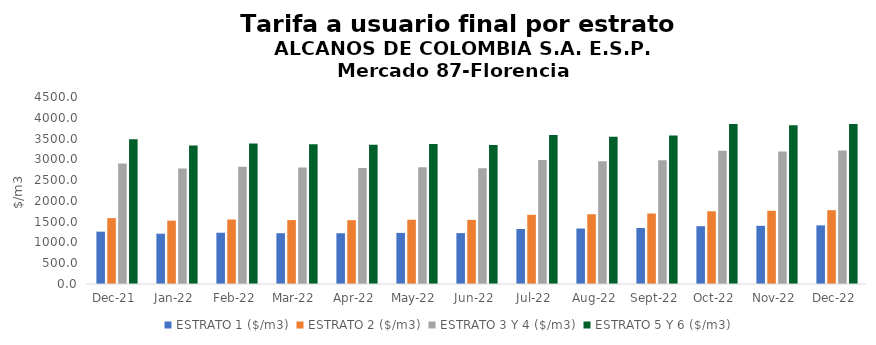
| Category | ESTRATO 1 ($/m3) | ESTRATO 2 ($/m3) | ESTRATO 3 Y 4 ($/m3) | ESTRATO 5 Y 6 ($/m3) |
|---|---|---|---|---|
| 2021-12-01 | 1260.02 | 1585.16 | 2902.39 | 3482.868 |
| 2022-01-01 | 1211.22 | 1524.02 | 2778.76 | 3334.512 |
| 2022-02-01 | 1233.39 | 1552.41 | 2818.77 | 3382.524 |
| 2022-03-01 | 1222.16 | 1538.54 | 2801.57 | 3361.884 |
| 2022-04-01 | 1220.79 | 1535.57 | 2791.83 | 3350.196 |
| 2022-05-01 | 1229.71 | 1546.92 | 2808.77 | 3370.524 |
| 2022-06-01 | 1224.76 | 1543.76 | 2787.21 | 3344.652 |
| 2022-07-01 | 1324.23 | 1665.88 | 2986.65 | 3583.98 |
| 2022-08-01 | 1334.86 | 1679.33 | 2951.9 | 3542.28 |
| 2022-09-01 | 1348.44 | 1696.41 | 2979.32 | 3575.184 |
| 2022-10-01 | 1390.28 | 1750.02 | 3208.12 | 3849.744 |
| 2022-11-01 | 1400.42 | 1762.52 | 3185.9 | 3823.08 |
| 2022-12-01 | 1410.99 | 1776 | 3209.93 | 3851.916 |